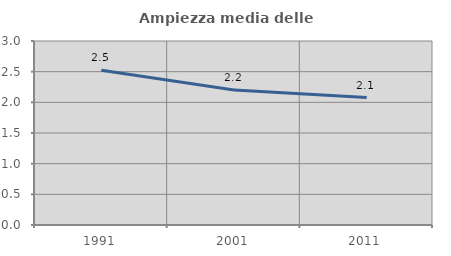
| Category | Ampiezza media delle famiglie |
|---|---|
| 1991.0 | 2.522 |
| 2001.0 | 2.2 |
| 2011.0 | 2.078 |